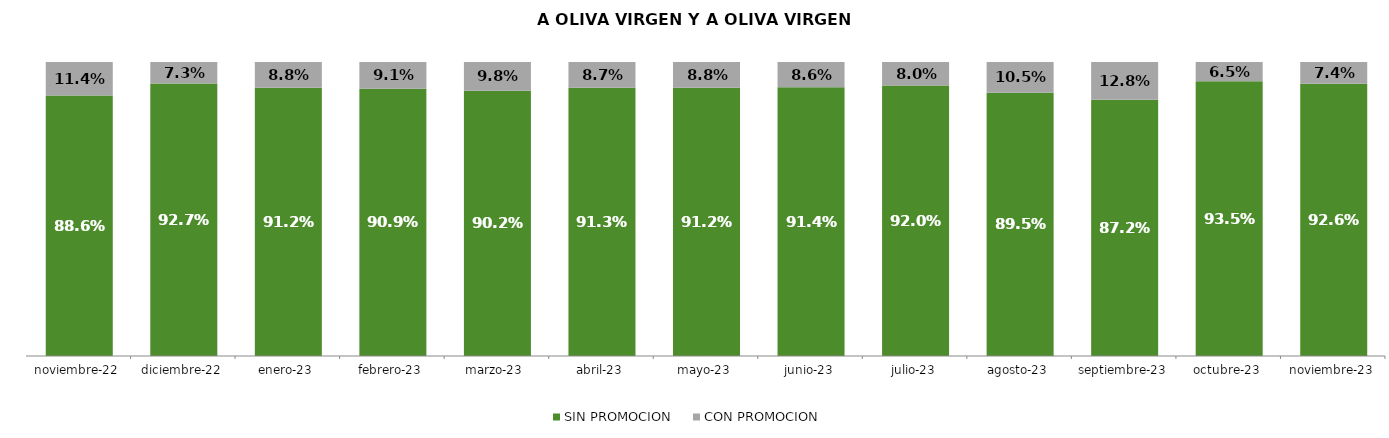
| Category | SIN PROMOCION   | CON PROMOCION   |
|---|---|---|
| 2022-11-01 | 0.886 | 0.114 |
| 2022-12-01 | 0.927 | 0.073 |
| 2023-01-01 | 0.912 | 0.088 |
| 2023-02-01 | 0.909 | 0.091 |
| 2023-03-01 | 0.902 | 0.098 |
| 2023-04-01 | 0.913 | 0.087 |
| 2023-05-01 | 0.912 | 0.088 |
| 2023-06-01 | 0.914 | 0.086 |
| 2023-07-01 | 0.92 | 0.08 |
| 2023-08-01 | 0.895 | 0.105 |
| 2023-09-01 | 0.872 | 0.128 |
| 2023-10-01 | 0.935 | 0.065 |
| 2023-11-01 | 0.926 | 0.074 |